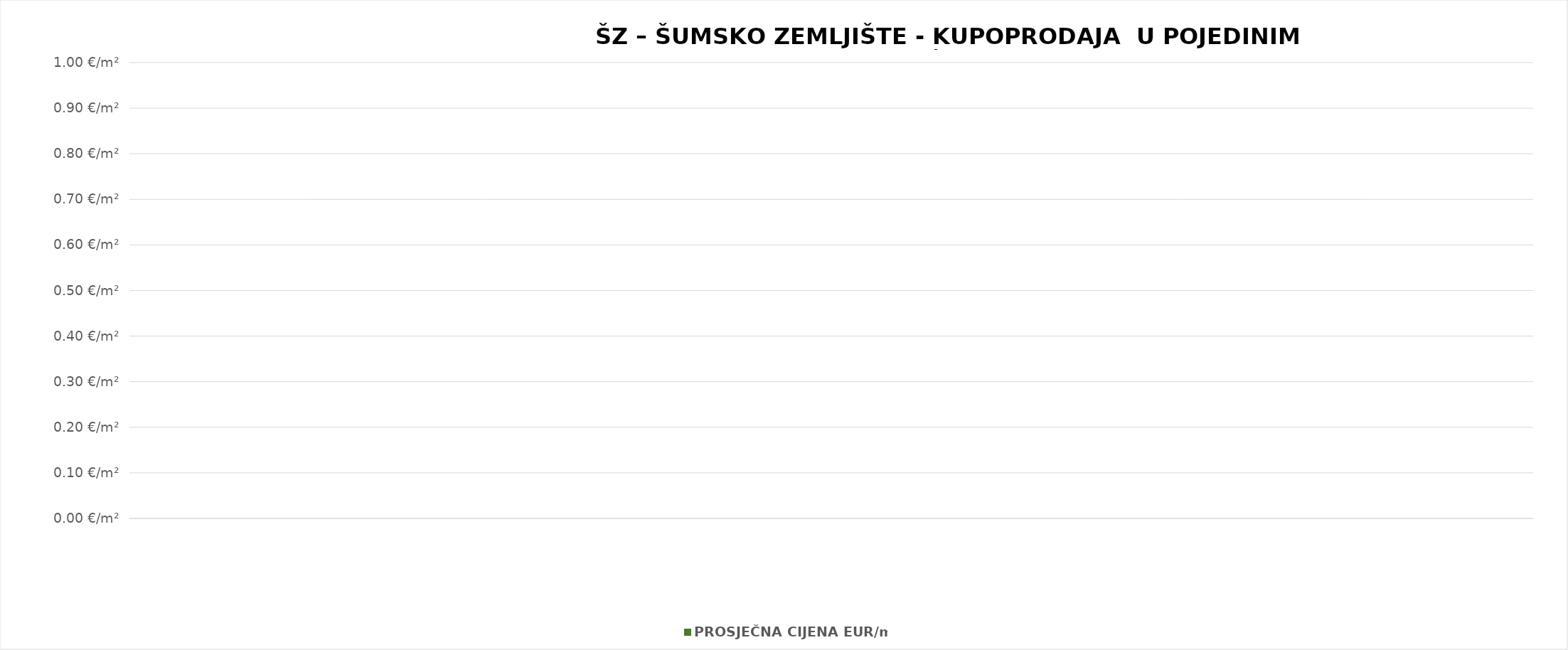
| Category | PROSJEČNA CIJENA EUR/m2 |
|---|---|
| 0 | 0 |
| 1 | 0 |